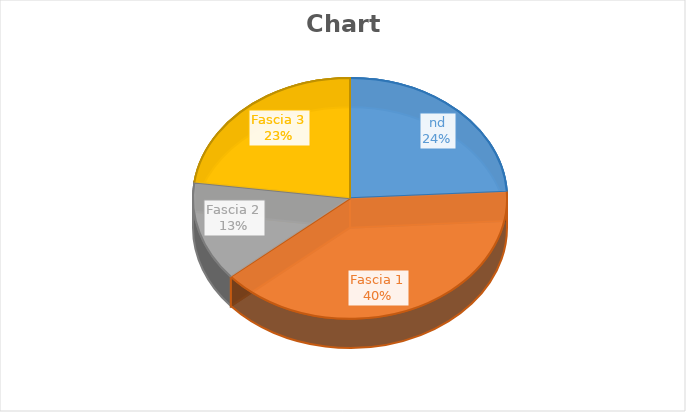
| Category | Series 0 |
|---|---|
| nd | 246546 |
| Fascia 1 | 404895 |
| Fascia 2 | 137072 |
| Fascia 3 | 234058 |